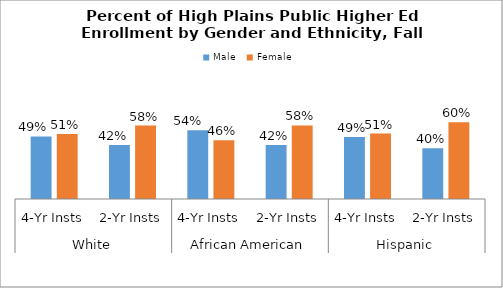
| Category | Male | Female |
|---|---|---|
| 0 | 0.491 | 0.509 |
| 1 | 0.424 | 0.576 |
| 2 | 0.539 | 0.461 |
| 3 | 0.423 | 0.577 |
| 4 | 0.487 | 0.513 |
| 5 | 0.398 | 0.602 |